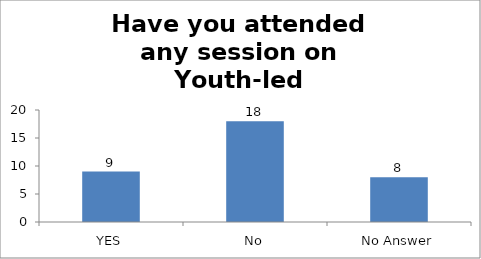
| Category | Have you attended any session on Youth-led Changemaking before? |
|---|---|
| YES | 9 |
| No | 18 |
| No Answer | 8 |